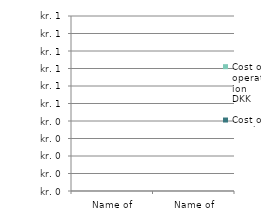
| Category | Cost of purchase DKK | Cost of operation DKK |
|---|---|---|
| Name of PRODUCT 1 | 0 | 0 |
| Name of PRODUCT 2 | 0 | 0 |